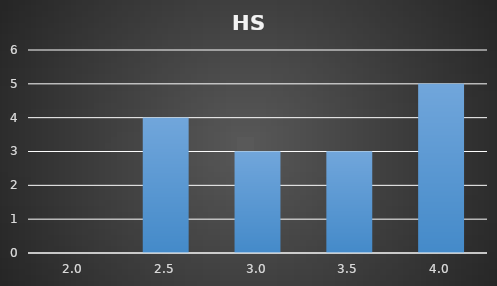
| Category | Frequency |
|---|---|
| 2.0 | 0 |
| 2.5 | 4 |
| 3.0 | 3 |
| 3.5 | 3 |
| 4.0 | 5 |